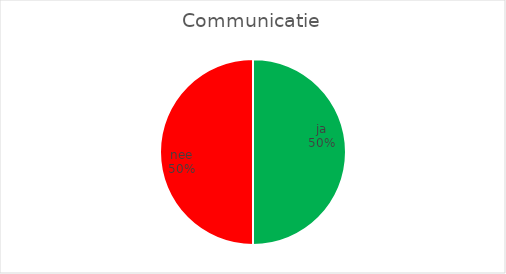
| Category | Communicatie |
|---|---|
| ja | 4 |
| nee | 4 |